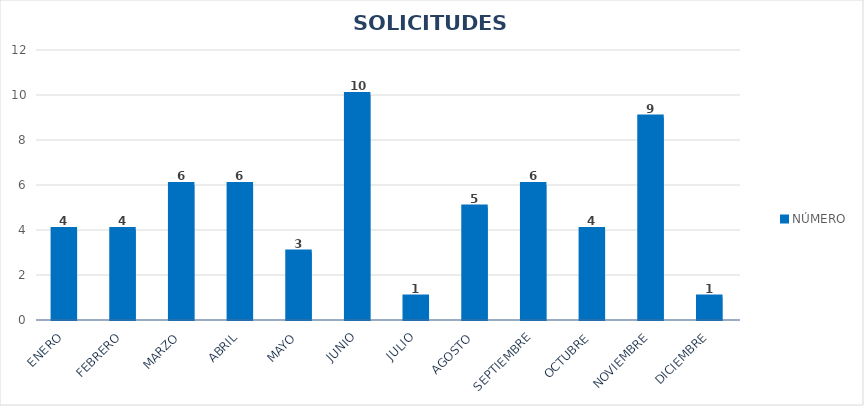
| Category | NÚMERO |
|---|---|
| Enero | 4 |
| Febrero | 4 |
| Marzo | 6 |
| Abril | 6 |
| Mayo | 3 |
| Junio | 10 |
| Julio | 1 |
| Agosto | 5 |
| Septiembre | 6 |
| Octubre | 4 |
| Noviembre | 9 |
| Diciembre | 1 |